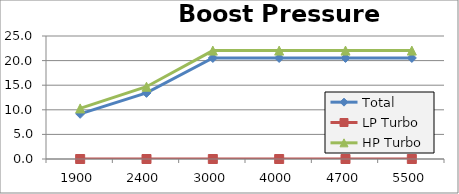
| Category | Total | LP Turbo | HP Turbo |
|---|---|---|---|
| 1900.0 | 9.183 | 0 | 10.283 |
| 2400.0 | 13.44 | 0 | 14.69 |
| 3000.0 | 20.535 | 0 | 22.035 |
| 4000.0 | 20.535 | 0 | 22.035 |
| 4700.0 | 20.535 | 0 | 22.035 |
| 5500.0 | 20.535 | 0 | 22.035 |